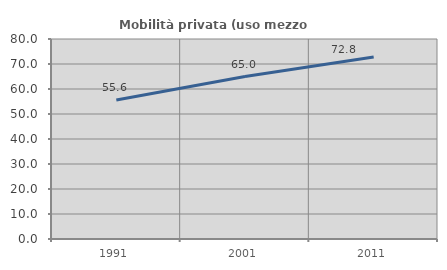
| Category | Mobilità privata (uso mezzo privato) |
|---|---|
| 1991.0 | 55.621 |
| 2001.0 | 64.996 |
| 2011.0 | 72.824 |